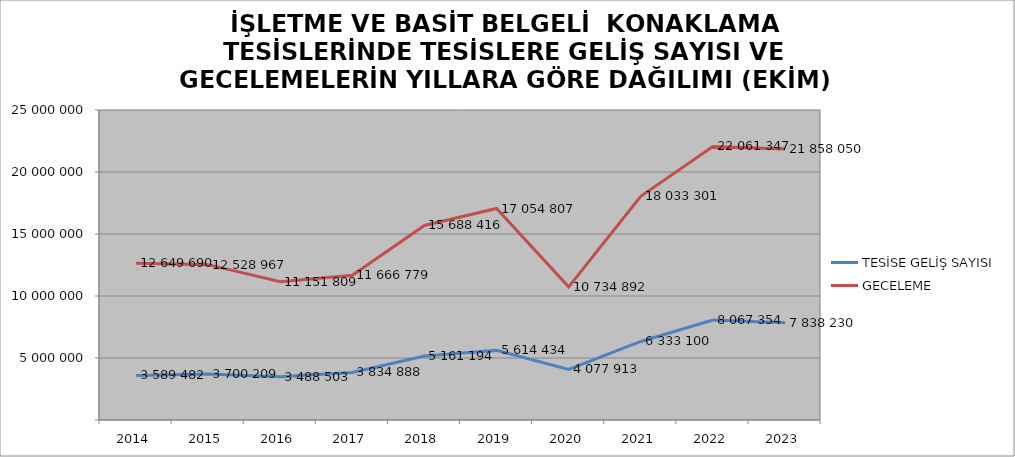
| Category | TESİSE GELİŞ SAYISI | GECELEME |
|---|---|---|
| 2014 | 3589482 | 12649690 |
| 2015 | 3700209 | 12528967 |
| 2016 | 3488503 | 11151809 |
| 2017 | 3834888 | 11666779 |
| 2018 | 5161194 | 15688416 |
| 2019 | 5614434 | 17054807 |
| 2020 | 4077913 | 10734892 |
| 2021 | 6333100 | 18033301 |
| 2022 | 8067354 | 22061347 |
| 2023 | 7838230 | 21858050 |